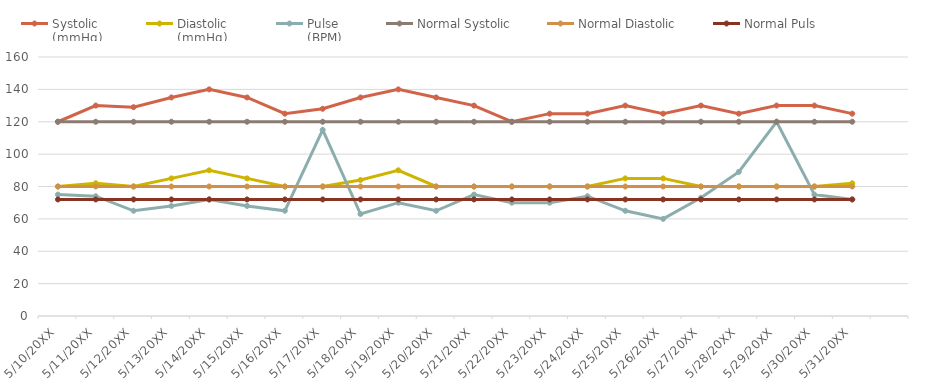
| Category | Systolic 
(mmHg) | Diastolic 
(mmHg) | Pulse 
(BPM) | Normal Systolic | Normal Diastolic | Normal Puls |
|---|---|---|---|---|---|---|
| 5/10/20XX | 120 | 80 | 75 | 120 | 80 | 72 |
| 5/11/20XX | 130 | 82 | 74 | 120 | 80 | 72 |
| 5/12/20XX | 129 | 80 | 65 | 120 | 80 | 72 |
| 5/13/20XX | 135 | 85 | 68 | 120 | 80 | 72 |
| 5/14/20XX | 140 | 90 | 72 | 120 | 80 | 72 |
| 5/15/20XX | 135 | 85 | 68 | 120 | 80 | 72 |
| 5/16/20XX | 125 | 80 | 65 | 120 | 80 | 72 |
| 5/17/20XX | 128 | 80 | 115 | 120 | 80 | 72 |
| 5/18/20XX | 135 | 84 | 63 | 120 | 80 | 72 |
| 5/19/20XX | 140 | 90 | 70 | 120 | 80 | 72 |
| 5/20/20XX | 135 | 80 | 65 | 120 | 80 | 72 |
| 5/21/20XX | 130 | 80 | 75 | 120 | 80 | 72 |
| 5/22/20XX | 120 | 80 | 70 | 120 | 80 | 72 |
| 5/23/20XX | 125 | 80 | 70 | 120 | 80 | 72 |
| 5/24/20XX | 125 | 80 | 74 | 120 | 80 | 72 |
| 5/25/20XX | 130 | 85 | 65 | 120 | 80 | 72 |
| 5/26/20XX | 125 | 85 | 60 | 120 | 80 | 72 |
| 5/27/20XX | 130 | 80 | 73 | 120 | 80 | 72 |
| 5/28/20XX | 125 | 80 | 89 | 120 | 80 | 72 |
| 5/29/20XX | 130 | 80 | 120 | 120 | 80 | 72 |
| 5/30/20XX | 130 | 80 | 75 | 120 | 80 | 72 |
| 5/31/20XX | 125 | 82 | 72 | 120 | 80 | 72 |